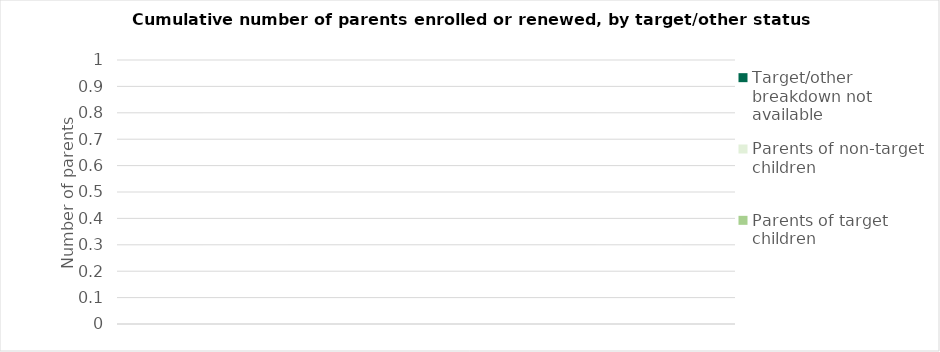
| Category | Parents of target children | Parents of non-target children | Target/other breakdown not available |
|---|---|---|---|
|  | 0 | 0 | 0 |
|  | 0 | 0 | 0 |
|  | 0 | 0 | 0 |
|  | 0 | 0 | 0 |
|  | 0 | 0 | 0 |
|  | 0 | 0 | 0 |
|  | 0 | 0 | 0 |
|  | 0 | 0 | 0 |
|  | 0 | 0 | 0 |
|  | 0 | 0 | 0 |
|  | 0 | 0 | 0 |
|  | 0 | 0 | 0 |
|  | 0 | 0 | 0 |